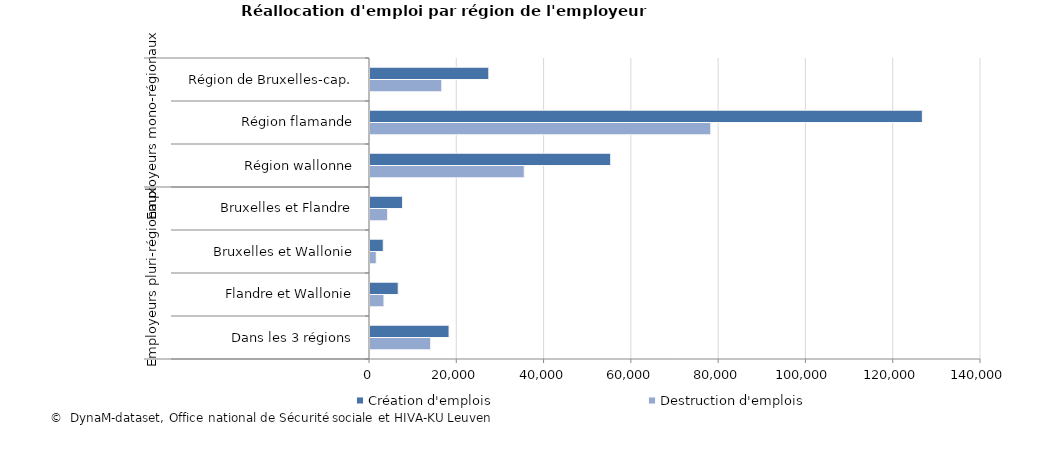
| Category | Création d'emplois | Destruction d'emplois |
|---|---|---|
| 0 | 27224 | 16451 |
| 1 | 126565 | 78087 |
| 2 | 55155 | 35343 |
| 3 | 7471 | 4045 |
| 4 | 3041 | 1434 |
| 5 | 6467 | 3197 |
| 6 | 18113 | 13908 |